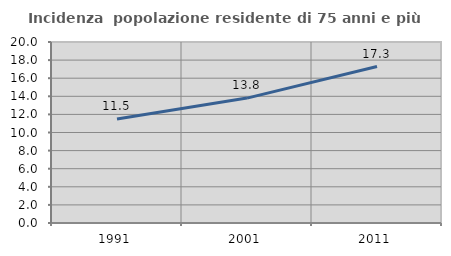
| Category | Incidenza  popolazione residente di 75 anni e più |
|---|---|
| 1991.0 | 11.498 |
| 2001.0 | 13.803 |
| 2011.0 | 17.291 |